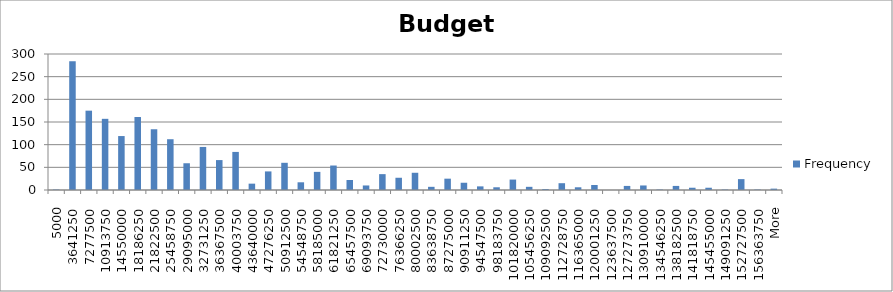
| Category | Frequency |
|---|---|
| 5000 | 1 |
| 3641250 | 284 |
| 7277500 | 175 |
| 10913750 | 157 |
| 14550000 | 119 |
| 18186250 | 161 |
| 21822500 | 134 |
| 25458750 | 112 |
| 29095000 | 59 |
| 32731250 | 95 |
| 36367500 | 66 |
| 40003750 | 84 |
| 43640000 | 14 |
| 47276250 | 41 |
| 50912500 | 60 |
| 54548750 | 17 |
| 58185000 | 40 |
| 61821250 | 54 |
| 65457500 | 22 |
| 69093750 | 10 |
| 72730000 | 35 |
| 76366250 | 27 |
| 80002500 | 38 |
| 83638750 | 7 |
| 87275000 | 25 |
| 90911250 | 16 |
| 94547500 | 8 |
| 98183750 | 6 |
| 101820000 | 23 |
| 105456250 | 7 |
| 109092500 | 2 |
| 112728750 | 15 |
| 116365000 | 6 |
| 120001250 | 11 |
| 123637500 | 0 |
| 127273750 | 9 |
| 130910000 | 10 |
| 134546250 | 1 |
| 138182500 | 9 |
| 141818750 | 5 |
| 145455000 | 5 |
| 149091250 | 1 |
| 152727500 | 24 |
| 156363750 | 1 |
| More | 3 |